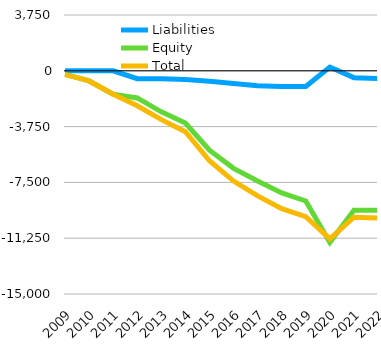
| Category | Liabilities  | Equity  | Total  |
|---|---|---|---|
| 2009 | 0 | -243 | -243 |
| 2010 | 0 | -682 | -682 |
| 2011 | 0 | -1578 | -1578 |
| 2012 | -529 | -1822 | -2351 |
| 2013 | -529 | -2755 | -3284 |
| 2014 | -585 | -3510 | -4095 |
| 2015 | -704 | -5340 | -6044 |
| 2016 | -855 | -6557 | -7412 |
| 2017 | -1001 | -7408 | -8409 |
| 2018 | -1048 | -8212 | -9260 |
| 2019 | -1051 | -8748 | -9799 |
| 2020 | 250 | -11541 | -11291 |
| 2021 | -460.6 | -9375.8 | -9836.4 |
| 2022 | -521.3 | -9376.6 | -9897.9 |